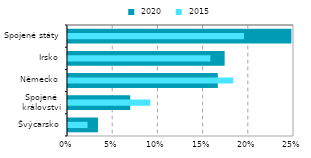
| Category |  2020 |
|---|---|
| Švýcarsko | 0.033 |
| Spojené
království | 0.069 |
| Německo | 0.166 |
| Irsko | 0.173 |
| Spojené státy | 0.247 |